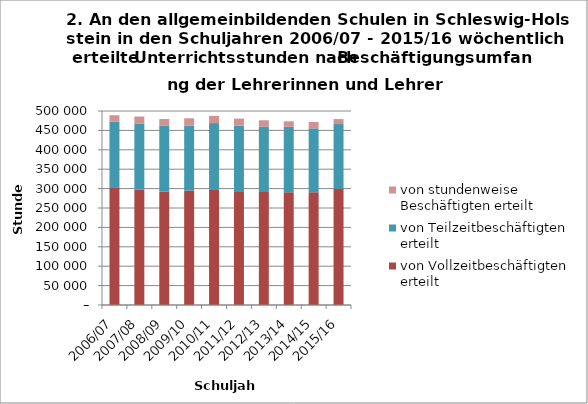
| Category | von Vollzeitbeschäftigten erteilt | von Teilzeitbeschäftigten erteilt | von stundenweise Beschäftigten erteilt |
|---|---|---|---|
| 2006/07 | 303324 | 169280 | 16449 |
| 2007/08 | 297791 | 170190 | 17805 |
| 2008/09 | 291959 | 170734 | 16797 |
| 2009/10 | 295146 | 167277 | 18723 |
| 2010/11 | 298224 | 170653 | 18597 |
| 2011/12 | 291177 | 170913 | 18338 |
| 2012/13 | 291267 | 168686 | 16162 |
| 2013/14 | 290577 | 168692 | 14261 |
| 2014/15 | 290801 | 164501.7 | 16418.7 |
| 2015/16 | 300119.6 | 166226.1 | 12878 |